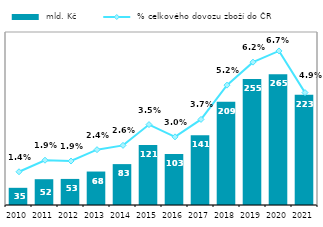
| Category |  mld. Kč |
|---|---|
| 2010.0 | 34.751 |
| 2011.0 | 52.182 |
| 2012.0 | 52.758 |
| 2013.0 | 67.707 |
| 2014.0 | 82.719 |
| 2015.0 | 121.222 |
| 2016.0 | 103.219 |
| 2017.0 | 141.049 |
| 2018.0 | 209.053 |
| 2019.0 | 255.061 |
| 2020.0 | 264.728 |
| 2021.0 | 223.242 |